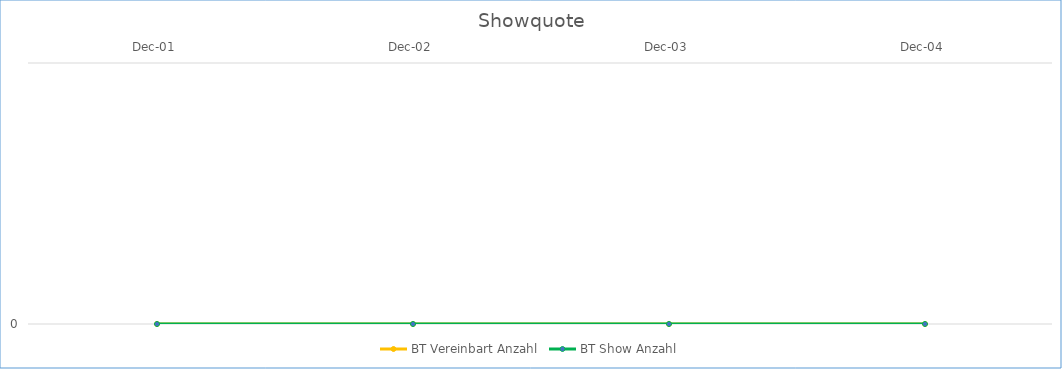
| Category | BT Vereinbart Anzahl | BT Show Anzahl |
|---|---|---|
| 2001-12-01 | 0 | 0 |
| 2002-12-01 | 0 | 0 |
| 2003-12-01 | 0 | 0 |
| 2004-12-01 | 0 | 0 |